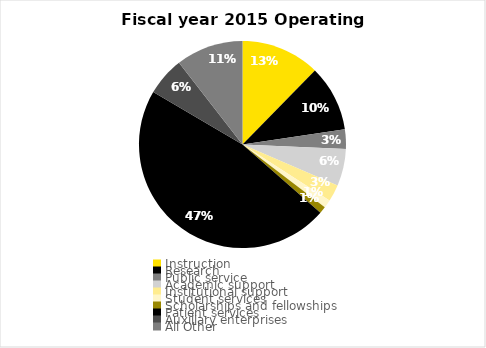
| Category | Series 0 |
|---|---|
| Instruction | 352.679 |
| Research | 294.655 |
| Public service | 87.622 |
| Academic support | 164.642 |
| Institutional support | 75.059 |
| Student services | 36.504 |
| Scholarships and fellowships | 30.569 |
| Patient services | 1343.804 |
| Auxiliary enterprises | 172.792 |
| All Other | 300.477 |